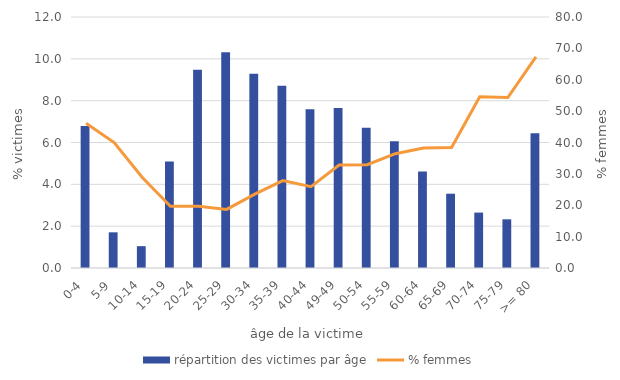
| Category | répartition des victimes par âge |
|---|---|
| 0-4 | 6.783 |
| 5-9 | 1.706 |
| 10-14 | 1.044 |
| 15-19 | 5.097 |
| 20-24 | 9.472 |
| 25-29 | 10.315 |
| 30-34 | 9.292 |
| 35-39 | 8.71 |
| 40-44 | 7.586 |
| 49-49 | 7.646 |
| 50-54 | 6.703 |
| 55-59 | 6.061 |
| 60-64 | 4.616 |
| 65-69 | 3.552 |
| 70-74 | 2.649 |
| 75-79 | 2.328 |
| >= 80 | 6.442 |